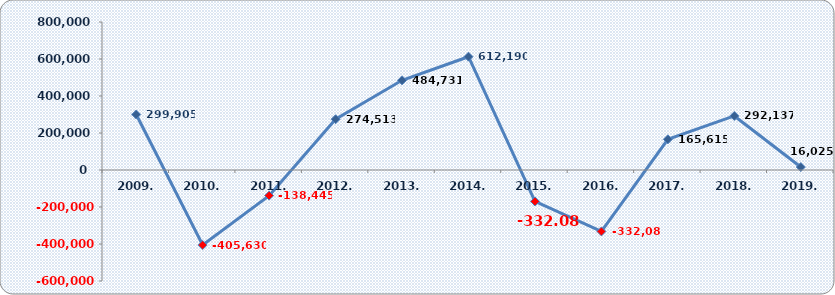
| Category | Dobit razdoblja (+) ili gubitak razdoblja (-)  |
|---|---|
| 2009. | 299905 |
| 2010. | -405630 |
| 2011. | -138445 |
| 2012. | 274513 |
| 2013. | 484731 |
| 2014. | 612190 |
| 2015. | -169937.776 |
| 2016. | -332084.15 |
| 2017. | 165615 |
| 2018. | 292137 |
| 2019. | 16025 |